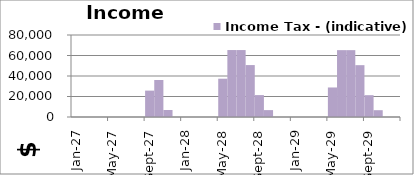
| Category | Income Tax - (indicative) |
|---|---|
| 2027-01-01 | 0 |
| 2027-02-01 | 0 |
| 2027-03-01 | 0 |
| 2027-04-01 | 0 |
| 2027-05-01 | 0 |
| 2027-06-01 | 0 |
| 2027-07-01 | 0 |
| 2027-08-01 | 0 |
| 2027-09-01 | 25731.578 |
| 2027-10-01 | 36125.321 |
| 2027-11-01 | 6833.768 |
| 2027-12-01 | 0 |
| 2028-01-01 | 0 |
| 2028-02-01 | 0 |
| 2028-03-01 | 0 |
| 2028-04-01 | 0 |
| 2028-05-01 | 37357.241 |
| 2028-06-01 | 65321.381 |
| 2028-07-01 | 65312.175 |
| 2028-08-01 | 50663.234 |
| 2028-09-01 | 21374.553 |
| 2028-10-01 | 6726.126 |
| 2028-11-01 | 0 |
| 2028-12-01 | 0 |
| 2029-01-01 | 0 |
| 2029-02-01 | 0 |
| 2029-03-01 | 0 |
| 2029-04-01 | 0 |
| 2029-05-01 | 28807.131 |
| 2029-06-01 | 65227.214 |
| 2029-07-01 | 65220.837 |
| 2029-08-01 | 50574.664 |
| 2029-09-01 | 21288.691 |
| 2029-10-01 | 6642.911 |
| 2029-11-01 | 0 |
| 2029-12-01 | 0 |